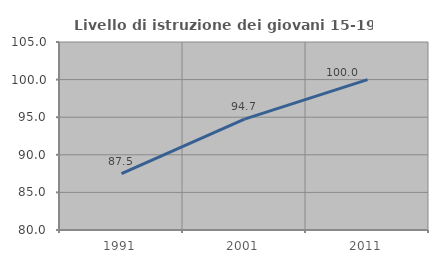
| Category | Livello di istruzione dei giovani 15-19 anni |
|---|---|
| 1991.0 | 87.5 |
| 2001.0 | 94.737 |
| 2011.0 | 100 |